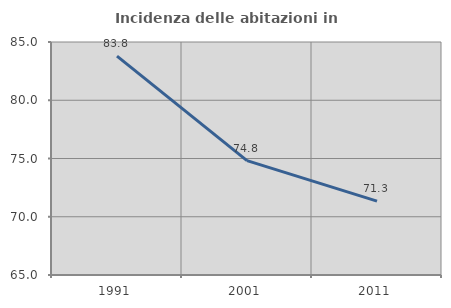
| Category | Incidenza delle abitazioni in proprietà  |
|---|---|
| 1991.0 | 83.784 |
| 2001.0 | 74.818 |
| 2011.0 | 71.347 |